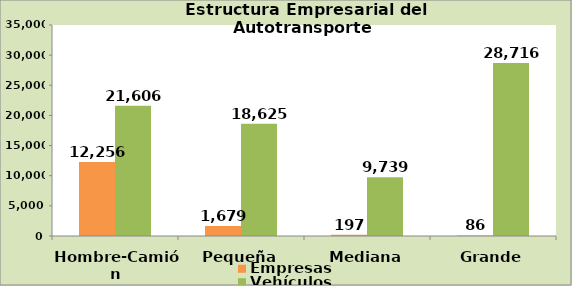
| Category | Empresas | Vehículos |
|---|---|---|
| Hombre-Camión | 12256 | 21606 |
| Pequeña | 1679 | 18625 |
| Mediana | 197 | 9739 |
| Grande | 86 | 28716 |